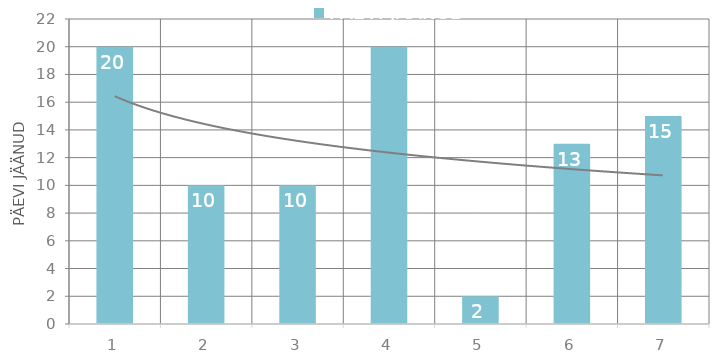
| Category | Kokku |
|---|---|
| 1 | 20 |
| 2 | 10 |
| 3 | 10 |
| 4 | 20 |
| 5 | 2 |
| 6 | 13 |
| 7 | 15 |